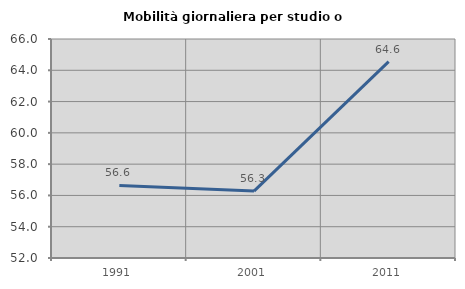
| Category | Mobilità giornaliera per studio o lavoro |
|---|---|
| 1991.0 | 56.638 |
| 2001.0 | 56.28 |
| 2011.0 | 64.556 |